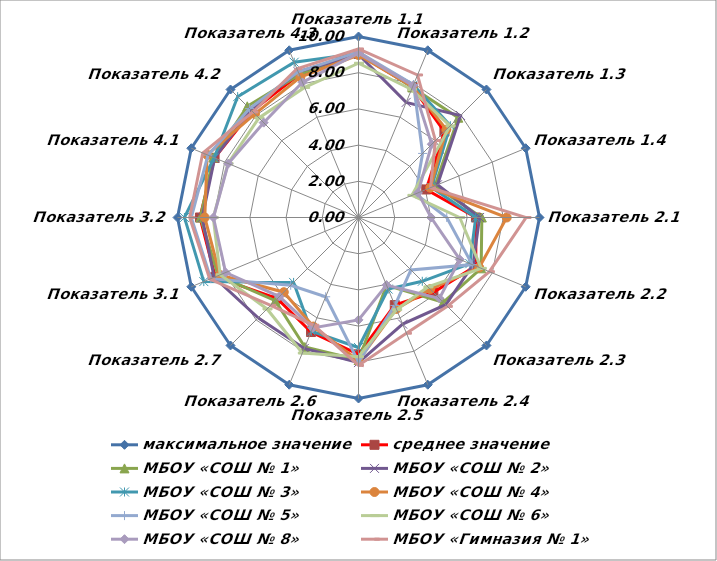
| Category | максимальное значение | среднее значение | МБОУ «СОШ № 1» | МБОУ «СОШ № 2» | МБОУ «СОШ № 3» | МБОУ «СОШ № 4» | МБОУ «СОШ № 5» | МБОУ «СОШ № 6» | МБОУ «СОШ № 8» | МБОУ «Гимназия № 1» |
|---|---|---|---|---|---|---|---|---|---|---|
| Показатель 1.1 | 10 | 9.033 | 9.148 | 9.007 | 9.064 | 8.977 | 9.148 | 8.522 | 9.083 | 9.312 |
| Показатель 1.2 | 10 | 7.803 | 7.776 | 6.884 | 7.929 | 7.825 | 7.948 | 7.657 | 7.884 | 8.524 |
| Показатель 1.3 | 10 | 6.713 | 7.796 | 7.972 | 7.174 | 6.865 | 5.007 | 7.156 | 5.724 | 6.012 |
| Показатель 1.4 | 10 | 4.051 | 4.567 | 4.723 | 4.358 | 4.291 | 3.415 | 3.194 | 3.557 | 4.304 |
| Показатель 2.1 | 10 | 6.489 | 6.814 | 6.689 | 6.476 | 8.19 | 4.877 | 5.595 | 4.01 | 9.257 |
| Показатель 2.2 | 10 | 7.011 | 7.336 | 6.848 | 6.659 | 7.219 | 6.802 | 7.344 | 6.056 | 7.827 |
| Показатель 2.3 | 10 | 5.851 | 6.623 | 6.816 | 4.984 | 5.599 | 4.095 | 5.424 | 6.322 | 6.943 |
| Показатель 2.4 | 10 | 5.239 | 4.057 | 6.374 | 4.28 | 5.469 | 5.258 | 5.511 | 4.043 | 6.918 |
| Показатель 2.5 | 10 | 7.56 | 7.872 | 8.015 | 7.185 | 7.91 | 7.982 | 7.69 | 5.657 | 8.17 |
| Показатель 2.6 | 10 | 6.849 | 7.744 | 7.83 | 6.803 | 6.521 | 4.741 | 8.106 | 6.604 | 6.444 |
| Показатель 2.7 | 10 | 6.342 | 6.502 | 7.842 | 5.072 | 5.836 | 5.297 | 7.146 | 6.177 | 6.86 |
| Показатель 3.1 | 10 | 8.563 | 8.389 | 8.632 | 9.251 | 8.291 | 8.83 | 8.272 | 7.943 | 8.894 |
| Показатель 3.2 | 10 | 8.76 | 8.735 | 8.632 | 9.617 | 8.492 | 9.24 | 8.025 | 8.014 | 9.327 |
| Показатель 4.1 | 10 | 8.608 | 8.677 | 8.6 | 8.629 | 9.051 | 9.004 | 7.801 | 7.787 | 9.313 |
| Показатель 4.2 | 10 | 8.323 | 8.69 | 8.419 | 9.443 | 8.09 | 8.509 | 7.778 | 7.411 | 8.245 |
| Показатель 4.3 | 10 | 8.551 | 8.539 | 8.718 | 9.285 | 8.392 | 8.713 | 7.778 | 8.085 | 8.894 |